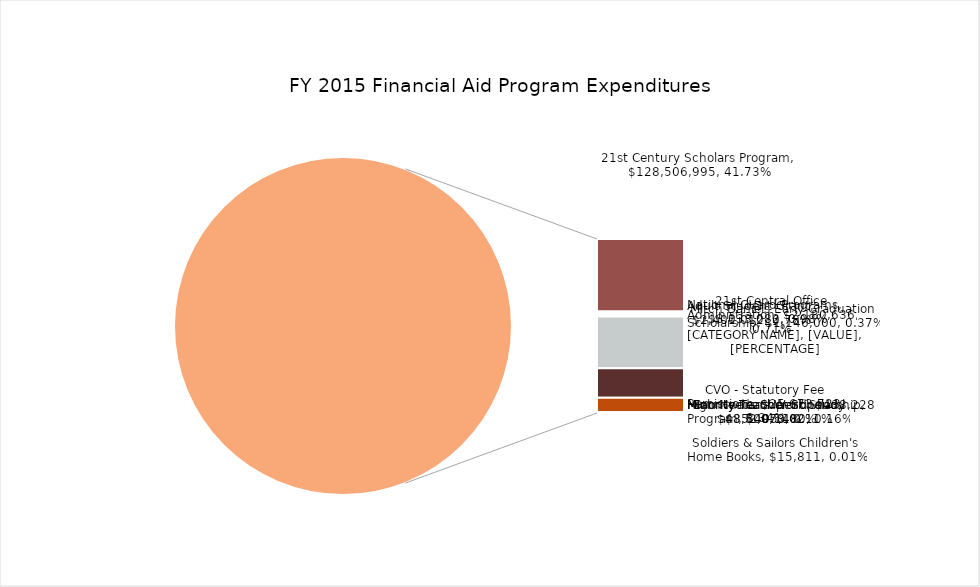
| Category | Series 0 |
|---|---|
| 21st Century Scholars Program | 128506995.05 |
| National Guard Programs | 3033081.94 |
| Adult Student Grant | 2401012 |
| 21st Central Office Administration | 2180636 |
| Mitch Daniels Early Graduation Scholarship | 1146000 |
| Higher Education Award | 91434081.45 |
| Freedom of Choice | 52251300 |
| CVO - Statutory Fee Remissions | 25673722.63 |
| Earn Indiana Work Study Program | 495180 |
| High Needs Stipend | 438227.54 |
| Minority Teacher Scholarship | 352073 |
| Minority Teacher Stipend | 48499.79 |
| Soldiers & Sailors Children's Home Books | 15810.8 |